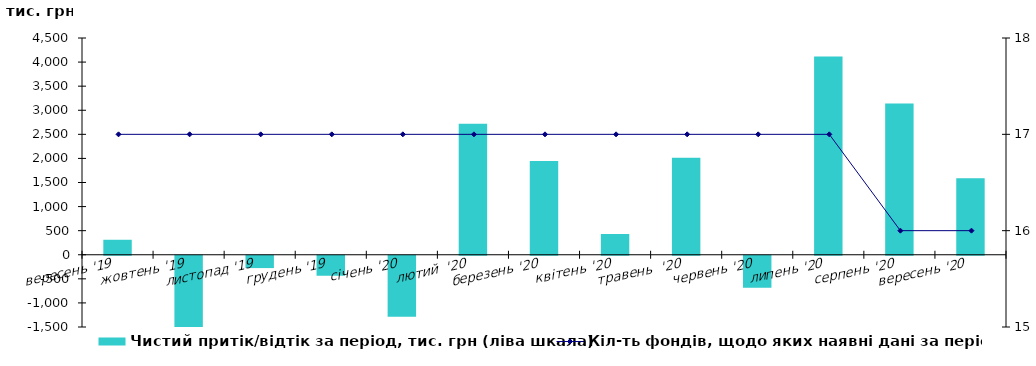
| Category | Чистий притік/відтік за період, тис. грн (ліва шкала) |
|---|---|
| вересень '19 | 311.168 |
| жовтень '19 | -1545.724 |
| листопад '19 | -255.903 |
| грудень '19 | -415.371 |
| січень '20 | -1268.023 |
| лютий  '20 | 2721.965 |
| березень '20 | 1946.081 |
| квітень '20 | 431.13 |
| травень  '20 | 2014.529 |
| червень '20 | -664.026 |
| липень '20 | 4118.162 |
| серпень '20 | 3141.082 |
| вересень '20 | 1590.018 |